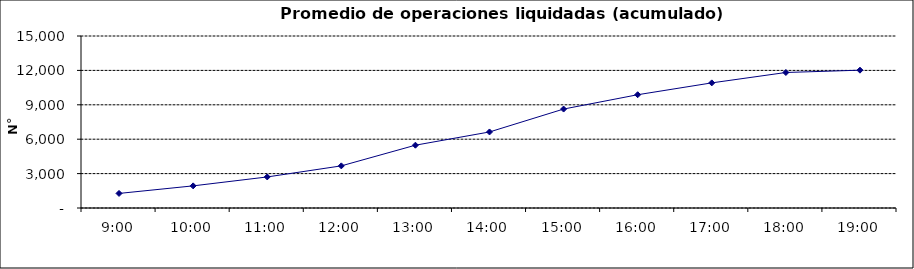
| Category | Promedio Op.Liquidadas (acumulado) |
|---|---|
| 0.375 | 1270.571 |
| 0.4166666666666667 | 1930.143 |
| 0.4583333333333333 | 2708.286 |
| 0.5 | 3674.619 |
| 0.5416666666666666 | 5476.524 |
| 0.5833333333333334 | 6630.714 |
| 0.625 | 8628.619 |
| 0.6666666666666666 | 9878.238 |
| 0.7083333333333334 | 10911 |
| 0.75 | 11817.524 |
| 0.7916666666666666 | 12018.619 |